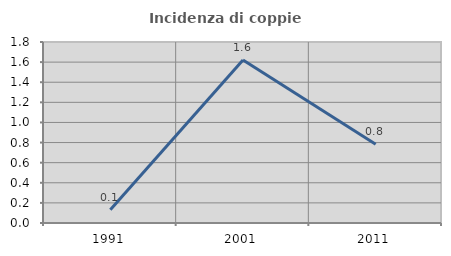
| Category | Incidenza di coppie miste |
|---|---|
| 1991.0 | 0.133 |
| 2001.0 | 1.622 |
| 2011.0 | 0.784 |